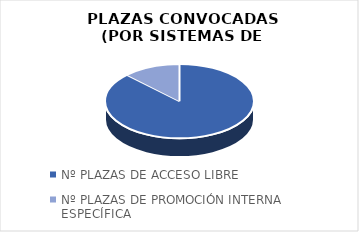
| Category | Series 0 |
|---|---|
| Nº PLAZAS DE ACCESO LIBRE | 4408 |
| Nº PLAZAS DE PROMOCIÓN INTERNA ESPECÍFICA | 628 |